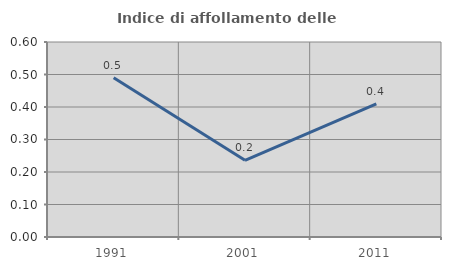
| Category | Indice di affollamento delle abitazioni  |
|---|---|
| 1991.0 | 0.49 |
| 2001.0 | 0.236 |
| 2011.0 | 0.409 |